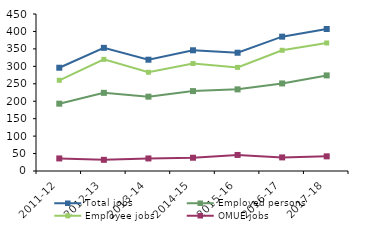
| Category | Total jobs | Employed persons | Employee jobs | OMUE jobs |
|---|---|---|---|---|
| 2011-12 | 296 | 193 | 260 | 36 |
| 2012-13 | 353 | 224 | 320 | 32 |
| 2013-14 | 319 | 213 | 283 | 36 |
| 2014-15 | 346 | 229 | 308 | 38 |
| 2015-16 | 339 | 234 | 297 | 46 |
| 2016-17 | 385 | 251 | 346 | 39 |
| 2017-18 | 407 | 274 | 367 | 42 |